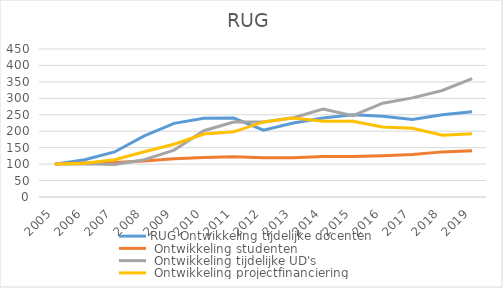
| Category | RUG |
|---|---|
| 2005.0 | 100 |
| 2006.0 | 102.313 |
| 2007.0 | 113.236 |
| 2008.0 | 137.719 |
| 2009.0 | 160.484 |
| 2010.0 | 191.391 |
| 2011.0 | 198.213 |
| 2012.0 | 228.209 |
| 2013.0 | 240.174 |
| 2014.0 | 230.37 |
| 2015.0 | 230.45 |
| 2016.0 | 213.138 |
| 2017.0 | 209.006 |
| 2018.0 | 187.611 |
| 2019.0 | 192.567 |